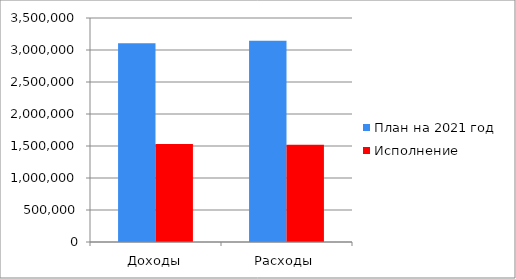
| Category | План на 2021 год | Исполнение |
|---|---|---|
| Доходы | 3105380 | 1533173 |
| Расходы | 3146207 | 1518869 |